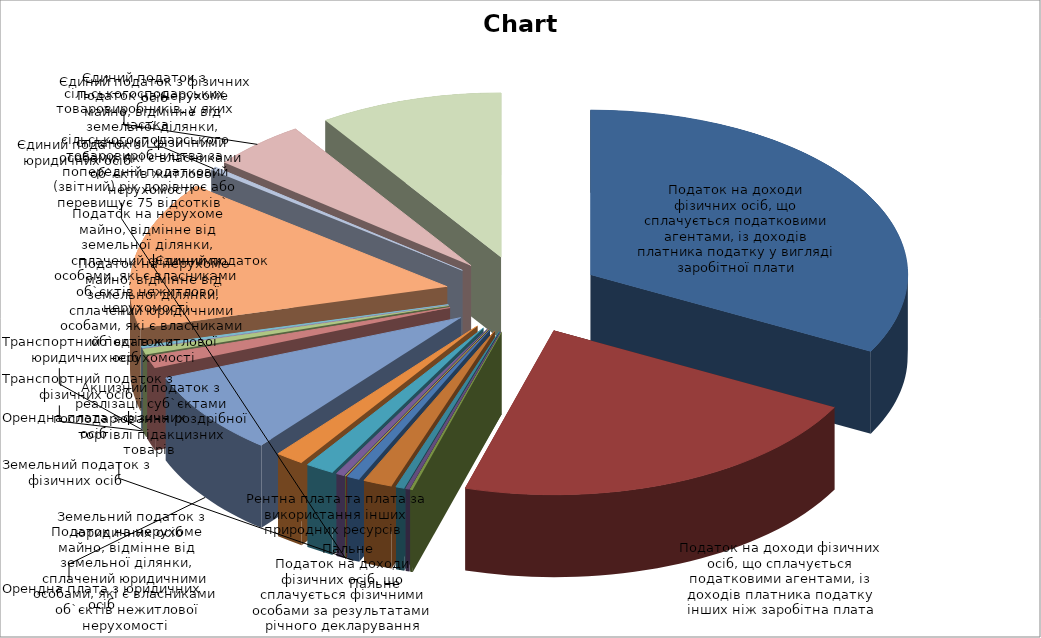
| Category | Series 0 | Series 1 |
|---|---|---|
| 0 | 17246951.33 | 111.412 |
| 1 | 11463165.05 | 161.367 |
| 2 | 69334.19 | 173.335 |
| 3 | 104515.11 | 385.665 |
| 4 | 230252.08 | 287.815 |
| 5 | 782434.11 | 299.783 |
| 6 | 345407.32 | 101.89 |
| 7 | 362.72 | 3.627 |
| 8 | 20899.95 | 133.121 |
| 9 | 226265.47 | 233.987 |
| 10 | 770407.74 | 176.902 |
| 11 | 771298.46 | 124.223 |
| 12 | 4313871.15 | 115.933 |
| 13 | 614720.65 | 132.826 |
| 14 | 293990.23 | 78.189 |
| 15 | 0 | 0 |
| 16 | 108733.33 | 226.528 |
| 17 | 7653714.05 | 105.481 |
| 18 | 176810.29 | 108.473 |
| 19 | 2558216.87 | 120.557 |
| 20 | 4918686.89 | 98.948 |